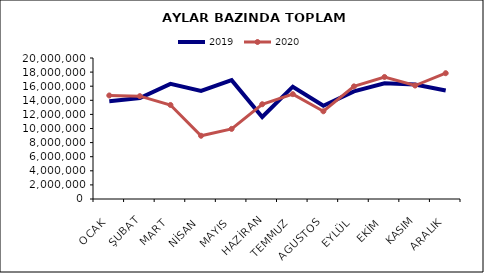
| Category | 2019 | 2020 |
|---|---|---|
| OCAK | 13874826.012 | 14686571.697 |
| ŞUBAT | 14323043.042 | 14590645.391 |
| MART | 16335862.397 | 13337963.507 |
| NİSAN | 15340619.825 | 8971149.086 |
| MAYIS | 16855105.097 | 9945551.187 |
| HAZİRAN | 11634653.881 | 13441948.869 |
| TEMMUZ | 15932004.724 | 14874577.423 |
| AGUSTOS | 13222876.223 | 12442671.819 |
| EYLÜL | 15273579.961 | 15976635.293 |
| EKİM | 16410781.68 | 17308722.315 |
| KASIM | 16242650.391 | 16093928.349 |
| ARALIK | 15386718.469 | 17843802.097 |